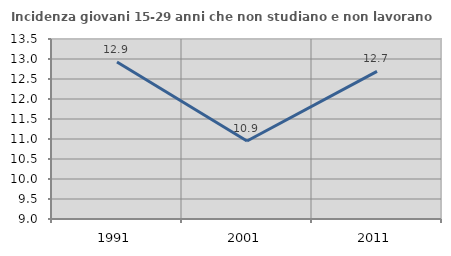
| Category | Incidenza giovani 15-29 anni che non studiano e non lavorano  |
|---|---|
| 1991.0 | 12.925 |
| 2001.0 | 10.949 |
| 2011.0 | 12.69 |